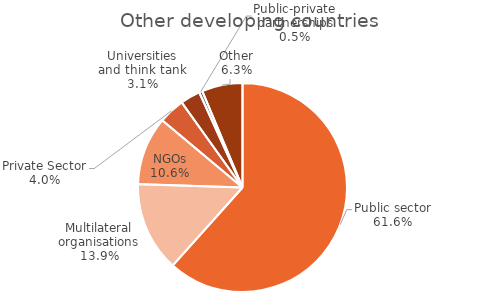
| Category | Series 0 |
|---|---|
| Public sector | 83035.344 |
| Multilateral organisations | 18737.092 |
| NGOs | 14253.264 |
| Private Sector | 5440.462 |
| Universities and think tank | 4152.588 |
| Public-private partnerships | 682.278 |
| Other | 8476.157 |